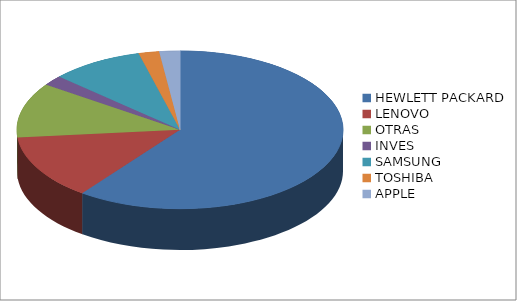
| Category | Series 0 |
|---|---|
| HEWLETT PACKARD | 59 |
| LENOVO | 13 |
| OTRAS | 11 |
| INVES | 2 |
| SAMSUNG | 9 |
| TOSHIBA | 2 |
| APPLE | 2 |